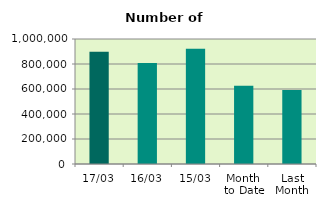
| Category | Series 0 |
|---|---|
| 17/03 | 898676 |
| 16/03 | 808606 |
| 15/03 | 922712 |
| Month 
to Date | 626400.923 |
| Last
Month | 592303 |